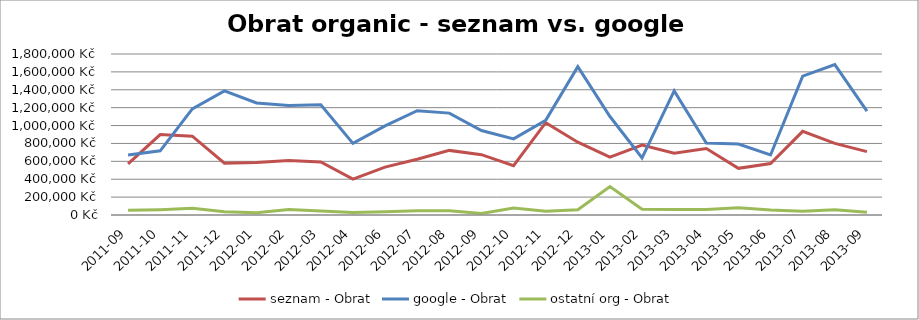
| Category | seznam - Obrat | google - Obrat | ostatní org - Obrat |
|---|---|---|---|
| 2011-09 | 571130.691 | 671565.195 | 52960.699 |
| 2011-10 | 898686.317 | 717117.856 | 59613.588 |
| 2011-11 | 881114.275 | 1186835.319 | 74153.067 |
| 2011-12 | 579597.42 | 1386671.474 | 35234.429 |
| 2012-01 | 587205.354 | 1251955.373 | 26256.449 |
| 2012-02 | 609886.789 | 1224576.752 | 60664.255 |
| 2012-03 | 592513.685 | 1232284.229 | 44893.178 |
| 2012-04 | 400427.063 | 801168.578 | 28219.817 |
| 2012-06 | 534996.107 | 996755.063 | 35606.995 |
| 2012-07 | 622966.237 | 1166128.609 | 47710.57 |
| 2012-08 | 722351.819 | 1139051.93 | 48029.886 |
| 2012-09 | 674108.386 | 944318.031 | 17580.826 |
| 2012-10 | 551582.303 | 851359.679 | 77926.861 |
| 2012-11 | 1032652.128 | 1058167.807 | 42908.08 |
| 2012-12 | 814154.252 | 1658971.542 | 58220.53 |
| 2013-01 | 647006.607 | 1101045.543 | 318835.241 |
| 2013-02 | 782116.968 | 638082.395 | 64095.601 |
| 2013-03 | 690735.037 | 1387209.197 | 62143.407 |
| 2013-04 | 743074.316 | 805102.971 | 60384.989 |
| 2013-05 | 521495.65 | 792843.207 | 81714.866 |
| 2013-06 | 574593.36 | 671056.775 | 56187.965 |
| 2013-07 | 935273.657 | 1551806.01 | 43020.616 |
| 2013-08 | 801157.479 | 1680993.922 | 58051.303 |
| 2013-09 | 708702.74 | 1162290.616 | 30470.876 |